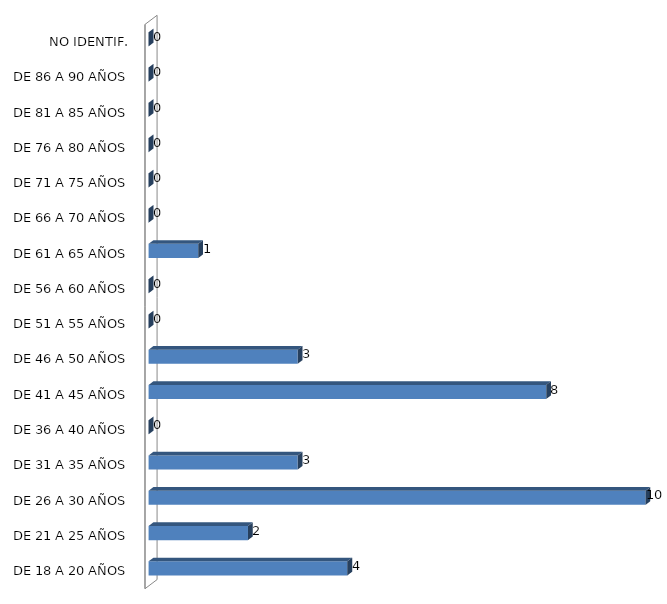
| Category | ESTADO  DE EBRIEDAD |
|---|---|
| DE 18 A 20 AÑOS | 4 |
| DE 21 A 25 AÑOS | 2 |
| DE 26 A 30 AÑOS | 10 |
| DE 31 A 35 AÑOS | 3 |
| DE 36 A 40 AÑOS | 0 |
| DE 41 A 45 AÑOS | 8 |
| DE 46 A 50 AÑOS | 3 |
| DE 51 A 55 AÑOS | 0 |
| DE 56 A 60 AÑOS | 0 |
| DE 61 A 65 AÑOS | 1 |
| DE 66 A 70 AÑOS | 0 |
| DE 71 A 75 AÑOS | 0 |
| DE 76 A 80 AÑOS | 0 |
| DE 81 A 85 AÑOS | 0 |
| DE 86 A 90 AÑOS | 0 |
| NO IDENTIF. | 0 |